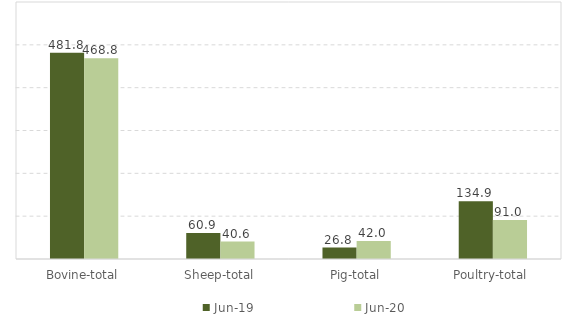
| Category | Jun-19 | Jun-20 |
|---|---|---|
| Bovine-total | 481.8 | 468.8 |
| Sheep-total | 60.9 | 40.6 |
| Pig-total | 26.8 | 42 |
| Poultry-total | 134.9 | 91 |